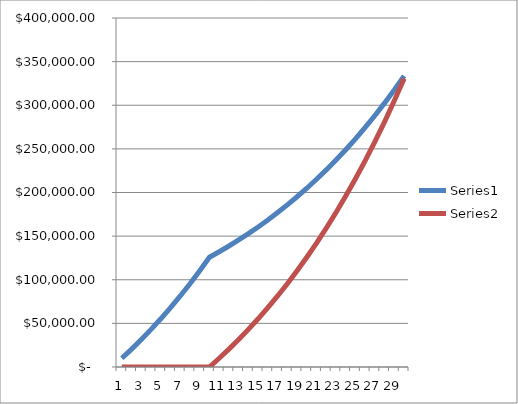
| Category | Series 0 | Series 1 |
|---|---|---|
| 0 | 10000 | 0 |
| 1 | 20500 | 0 |
| 2 | 31525 | 0 |
| 3 | 43101.25 | 0 |
| 4 | 55256.312 | 0 |
| 5 | 68019.128 | 0 |
| 6 | 81420.085 | 0 |
| 7 | 95491.089 | 0 |
| 8 | 110265.643 | 0 |
| 9 | 125778.925 | 0 |
| 10 | 132067.872 | 10000 |
| 11 | 138671.265 | 20500 |
| 12 | 145604.828 | 31525 |
| 13 | 152885.07 | 43101.25 |
| 14 | 160529.323 | 55256.312 |
| 15 | 168555.79 | 68019.128 |
| 16 | 176983.579 | 81420.085 |
| 17 | 185832.758 | 95491.089 |
| 18 | 195124.396 | 110265.643 |
| 19 | 204880.616 | 125778.925 |
| 20 | 215124.646 | 142067.872 |
| 21 | 225880.879 | 159171.265 |
| 22 | 237174.923 | 177129.828 |
| 23 | 249033.669 | 195986.32 |
| 24 | 261485.352 | 215785.636 |
| 25 | 274559.62 | 236574.918 |
| 26 | 288287.601 | 258403.664 |
| 27 | 302701.981 | 281323.847 |
| 28 | 317837.08 | 305390.039 |
| 29 | 333728.934 | 330659.541 |